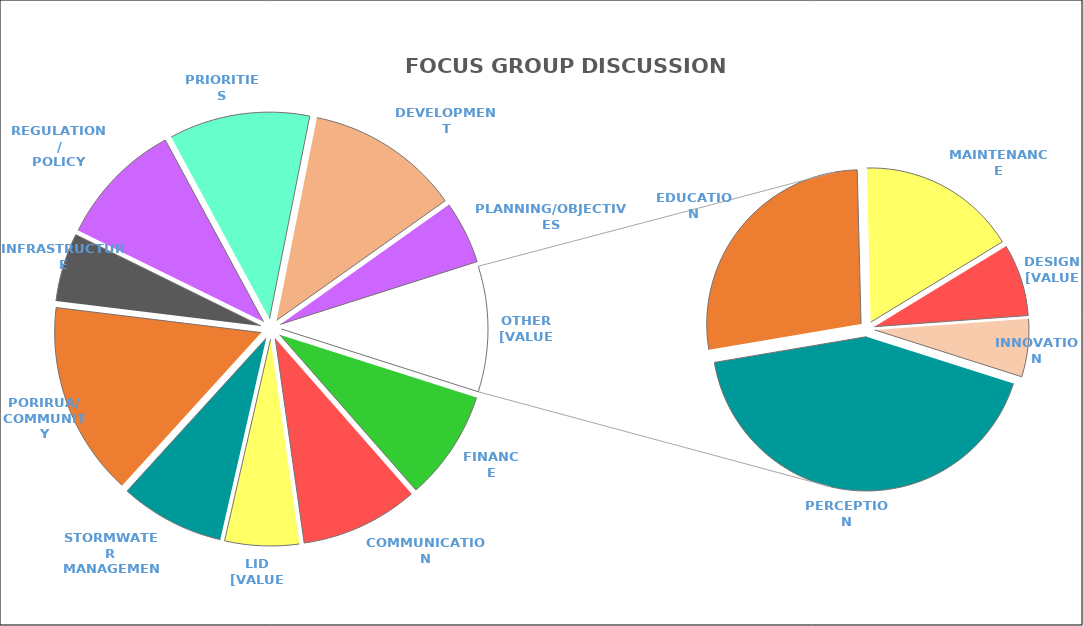
| Category | Series 0 |
|---|---|
| FINANCE | 0.086 |
| COMMUNICATION | 0.092 |
| LID | 0.058 |
| STORMWATER MANAGEMENT | 0.082 |
| PORIRUA/COMMUNITY | 0.152 |
| INFRASTRUCTURE | 0.054 |
| REGULATION/POLICY | 0.098 |
| PRIORITIES | 0.11 |
| DEVELOPMENT | 0.121 |
| PLANNIN/OBJECTIVES | 0.049 |
| PERCEPTION | 0.042 |
| EDUCATION | 0.027 |
| MAINTENANCE | 0.016 |
| DESIGN | 0.007 |
| INNOVATION | 0.006 |